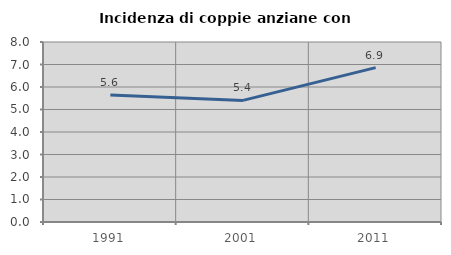
| Category | Incidenza di coppie anziane con figli |
|---|---|
| 1991.0 | 5.645 |
| 2001.0 | 5.405 |
| 2011.0 | 6.863 |